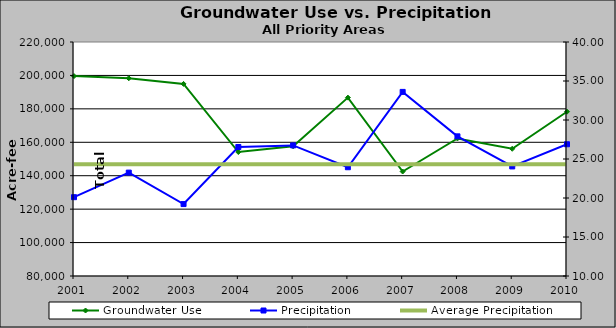
| Category | Groundwater Use |
|---|---|
| 2001.0 | 199609.17 |
| 2002.0 | 198312.76 |
| 2003.0 | 194924.85 |
| 2004.0 | 154154.15 |
| 2005.0 | 157611.1 |
| 2006.0 | 186722.51 |
| 2007.0 | 142505.37 |
| 2008.0 | 162299.35 |
| 2009.0 | 156119.01 |
| 2010.0 | 178306.39 |